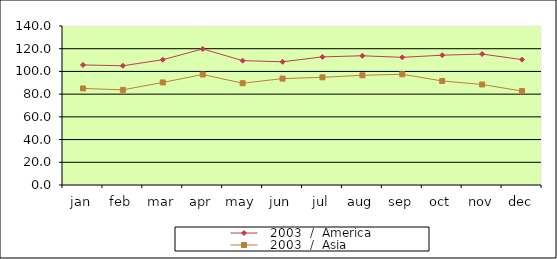
| Category |   2003  /  America |   2003  /  Asia |
|---|---|---|
| jan | 105.7 | 85 |
| feb | 105 | 83.8 |
| mar | 110.3 | 90.3 |
| apr | 119.8 | 97.3 |
| may | 109.5 | 89.6 |
| jun | 108.5 | 93.7 |
| jul | 112.8 | 94.8 |
| aug | 113.8 | 96.6 |
| sep | 112.4 | 97.5 |
| oct | 114.3 | 91.6 |
| nov | 115.3 | 88.5 |
| dec | 110.4 | 82.7 |